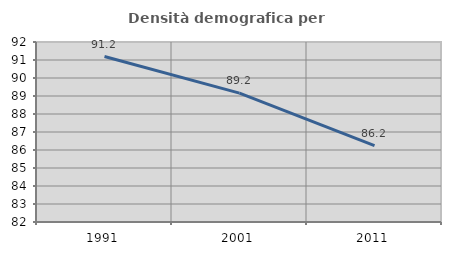
| Category | Densità demografica |
|---|---|
| 1991.0 | 91.191 |
| 2001.0 | 89.158 |
| 2011.0 | 86.24 |